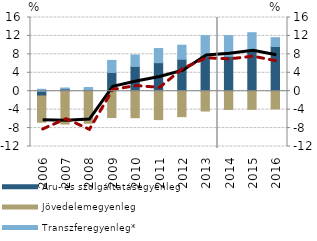
| Category | Áru- és szolgáltatásegyenleg | Jövedelemegyenleg | Transzferegyenleg* |
|---|---|---|---|
| 2006.0 | -1.031 | -5.7 | 0.418 |
| 2007.0 | 0.498 | -7.131 | 0.202 |
| 2008.0 | 0.36 | -6.946 | 0.439 |
| 2009.0 | 4.069 | -5.722 | 2.617 |
| 2010.0 | 5.375 | -5.752 | 2.492 |
| 2011.0 | 6.189 | -6.165 | 3.071 |
| 2012.0 | 6.928 | -5.522 | 3.059 |
| 2013.0 | 7.586 | -4.296 | 4.474 |
| 2014.0 | 7.595 | -3.961 | 4.474 |
| 2015.0 | 8.665 | -3.934 | 4.037 |
| 2016.0 | 9.701 | -3.836 | 1.921 |